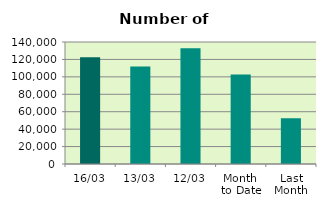
| Category | Series 0 |
|---|---|
| 16/03 | 122472 |
| 13/03 | 111840 |
| 12/03 | 132874 |
| Month 
to Date | 102768.182 |
| Last
Month | 52501.6 |